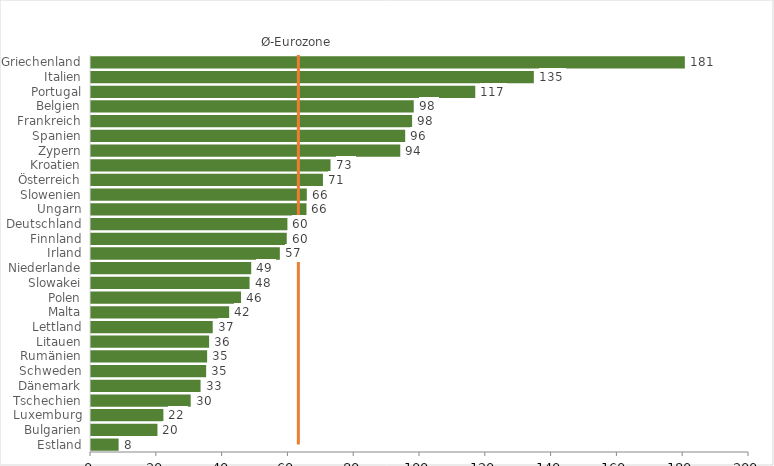
| Category | 2019 |
|---|---|
| Estland | 8.4 |
| Bulgarien | 20.2 |
| Luxemburg | 22 |
| Tschechien | 30.3 |
| Dänemark | 33.3 |
| Schweden | 35 |
| Rumänien | 35.3 |
| Litauen | 35.9 |
| Lettland | 37 |
| Malta | 42 |
| Polen | 45.6 |
| Slowakei | 48.2 |
| Niederlande | 48.7 |
| Irland | 57.4 |
| Finnland | 59.5 |
| Deutschland | 59.7 |
| Ungarn | 65.5 |
| Slowenien | 65.6 |
| Österreich | 70.5 |
| Kroatien | 72.8 |
| Zypern | 94 |
| Spanien | 95.5 |
| Frankreich | 97.6 |
| Belgien | 98.1 |
| Portugal | 116.8 |
| Italien | 134.6 |
| Griechenland | 180.5 |